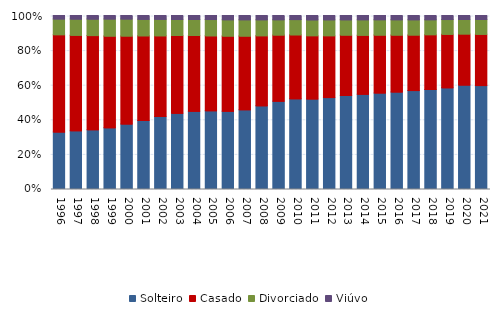
| Category | Solteiro | Casado | Divorciado | Viúvo |
|---|---|---|---|---|
| 1996.0 | 32.709 | 56.228 | 9.088 | 1.975 |
| 1997.0 | 33.314 | 55.268 | 9.358 | 2.059 |
| 1998.0 | 33.935 | 54.435 | 9.551 | 2.078 |
| 1999.0 | 35.075 | 53.038 | 9.887 | 2 |
| 2000.0 | 37.27 | 50.91 | 9.822 | 1.998 |
| 2001.0 | 39.292 | 48.963 | 9.551 | 2.193 |
| 2002.0 | 41.665 | 46.608 | 9.543 | 2.184 |
| 2003.0 | 43.469 | 45.035 | 9.239 | 2.257 |
| 2004.0 | 44.659 | 43.823 | 9.234 | 2.285 |
| 2005.0 | 44.925 | 43.336 | 9.397 | 2.341 |
| 2006.0 | 44.684 | 43.441 | 9.456 | 2.419 |
| 2007.0 | 45.511 | 42.605 | 9.456 | 2.429 |
| 2008.0 | 47.8 | 40.512 | 9.237 | 2.45 |
| 2009.0 | 50.483 | 38.272 | 8.839 | 2.405 |
| 2010.0 | 51.867 | 36.946 | 8.805 | 2.382 |
| 2011.0 | 51.802 | 36.556 | 9.12 | 2.523 |
| 2012.0 | 52.536 | 35.802 | 9.194 | 2.468 |
| 2013.0 | 53.765 | 34.902 | 8.879 | 2.454 |
| 2014.0 | 54.497 | 34.11 | 8.957 | 2.436 |
| 2015.0 | 55.226 | 33.447 | 8.927 | 2.4 |
| 2016.0 | 55.798 | 32.885 | 8.893 | 2.425 |
| 2017.0 | 56.592 | 32.156 | 8.807 | 2.445 |
| 2018.0 | 57.229 | 31.711 | 8.651 | 2.409 |
| 2019.0 | 58.222 | 30.941 | 8.497 | 2.341 |
| 2020.0 | 59.798 | 29.566 | 8.38 | 2.255 |
| 2021.0 | 59.472 | 29.693 | 8.513 | 2.321 |